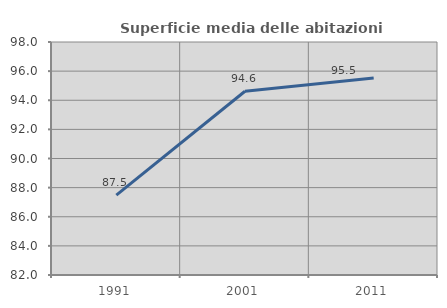
| Category | Superficie media delle abitazioni occupate |
|---|---|
| 1991.0 | 87.487 |
| 2001.0 | 94.618 |
| 2011.0 | 95.521 |